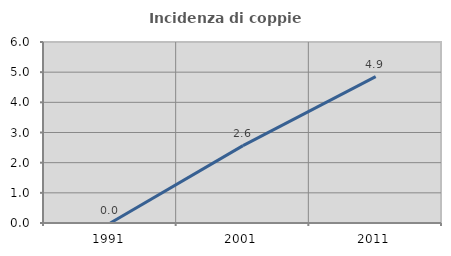
| Category | Incidenza di coppie miste |
|---|---|
| 1991.0 | 0 |
| 2001.0 | 2.564 |
| 2011.0 | 4.854 |